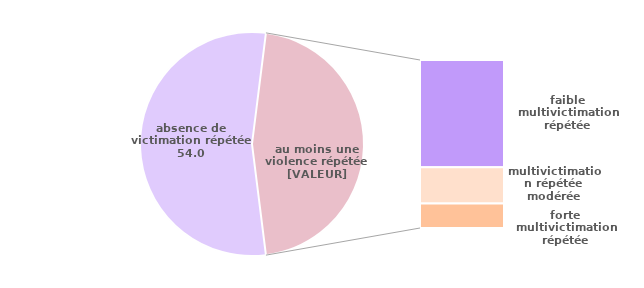
| Category | Series 0 |
|---|---|
| absence de victimation répétée | 53.973 |
| faible multivictimation répétée | 29.378 |
| multivictimation répétée modérée | 9.911 |
| forte multivictimation répétée | 6.738 |